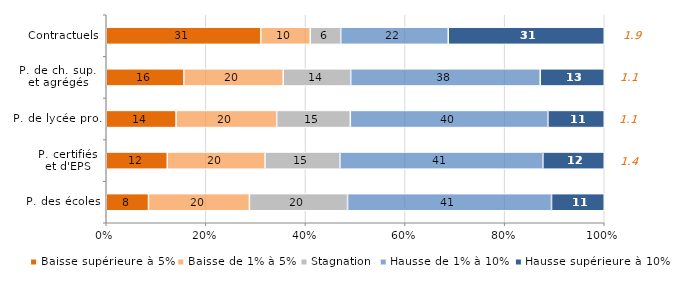
| Category | Baisse supérieure à 5% | Baisse de 1% à 5% | Stagnation | Hausse de 1% à 10% | Hausse supérieure à 10% |
|---|---|---|---|---|---|
| P. des écoles | 8.482 | 20.267 | 19.71 | 40.952 | 10.589 |
| P. certifiés
et d'EPS | 12.258 | 19.605 | 15.057 | 40.763 | 12.318 |
| P. de lycée pro. | 14.019 | 20.204 | 14.789 | 39.673 | 11.315 |
| P. de ch. sup. 
et agrégés | 15.587 | 19.948 | 13.553 | 38.058 | 12.854 |
| Contractuels | 31.019 | 9.943 | 6.12 | 21.589 | 31.329 |